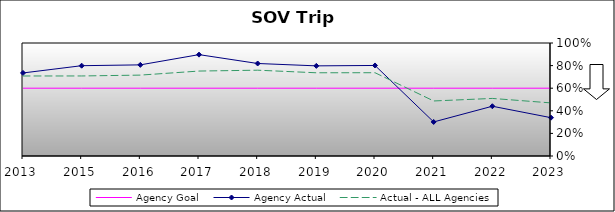
| Category | Agency Goal | Agency Actual | Actual - ALL Agencies |
|---|---|---|---|
| 2013.0 | 0.6 | 0.735 | 0.708 |
| 2015.0 | 0.6 | 0.799 | 0.708 |
| 2016.0 | 0.6 | 0.806 | 0.716 |
| 2017.0 | 0.6 | 0.897 | 0.752 |
| 2018.0 | 0.6 | 0.819 | 0.759 |
| 2019.0 | 0.6 | 0.798 | 0.736 |
| 2020.0 | 0.6 | 0.801 | 0.737 |
| 2021.0 | 0.6 | 0.301 | 0.487 |
| 2022.0 | 0.6 | 0.44 | 0.509 |
| 2023.0 | 0.6 | 0.339 | 0.47 |